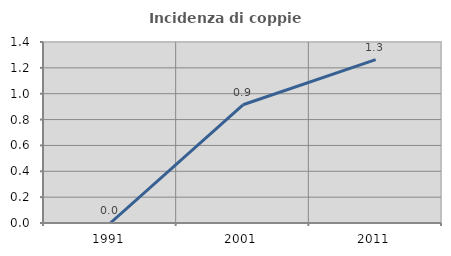
| Category | Incidenza di coppie miste |
|---|---|
| 1991.0 | 0 |
| 2001.0 | 0.914 |
| 2011.0 | 1.264 |